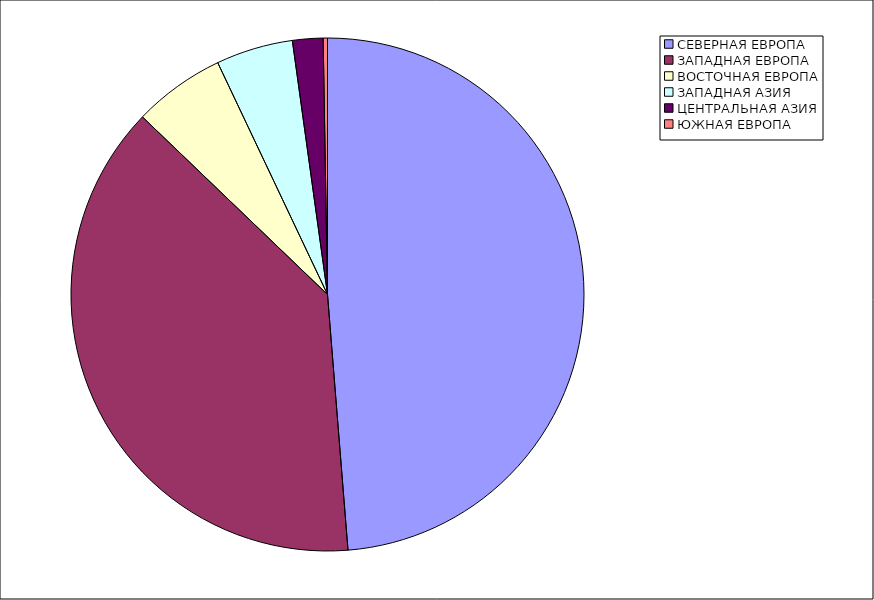
| Category | Оборот |
|---|---|
| СЕВЕРНАЯ ЕВРОПА | 48.73 |
| ЗАПАДНАЯ ЕВРОПА | 38.45 |
| ВОСТОЧНАЯ ЕВРОПА | 5.79 |
| ЗАПАДНАЯ АЗИЯ | 4.85 |
| ЦЕНТРАЛЬНАЯ АЗИЯ | 1.92 |
| ЮЖНАЯ ЕВРОПА | 0.27 |